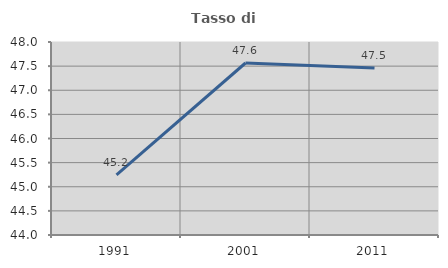
| Category | Tasso di occupazione   |
|---|---|
| 1991.0 | 45.246 |
| 2001.0 | 47.565 |
| 2011.0 | 47.461 |